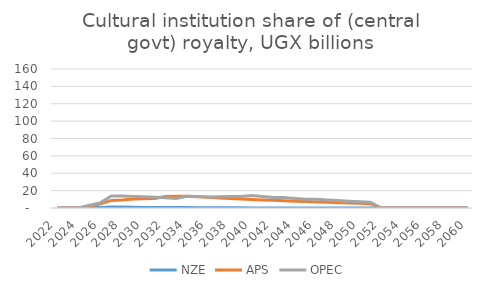
| Category | NZE | APS | OPEC |
|---|---|---|---|
| 2022.0 | 0 | 0 | 0 |
| 2023.0 | 0 | 0 | 0 |
| 2024.0 | 0 | 0 | 0 |
| 2025.0 | 0.379 | 2.177 | 3.181 |
| 2026.0 | 0.703 | 4.771 | 6.225 |
| 2027.0 | 1.242 | 8.715 | 13.737 |
| 2028.0 | 1.242 | 9.274 | 13.867 |
| 2029.0 | 0.879 | 10.394 | 13.381 |
| 2030.0 | 0.515 | 10.576 | 12.908 |
| 2031.0 | 0.514 | 11.024 | 12.446 |
| 2032.0 | 0.513 | 13.312 | 11.933 |
| 2033.0 | 0.493 | 13.628 | 11.042 |
| 2034.0 | 0.462 | 13.565 | 13.565 |
| 2035.0 | 0.426 | 12.925 | 13.138 |
| 2036.0 | 0.393 | 12.274 | 12.657 |
| 2037.0 | 0.362 | 11.621 | 13.001 |
| 2038.0 | 0.334 | 10.975 | 13.146 |
| 2039.0 | 0.307 | 10.34 | 13.13 |
| 2040.0 | 0.084 | 9.847 | 14.238 |
| 2041.0 | 0 | 9.349 | 13.173 |
| 2042.0 | 0 | 8.851 | 12.15 |
| 2043.0 | 0 | 8.36 | 11.976 |
| 2044.0 | 0 | 7.878 | 11.051 |
| 2045.0 | 0 | 7.41 | 10.2 |
| 2046.0 | 0 | 6.958 | 10.02 |
| 2047.0 | 0 | 6.524 | 9.253 |
| 2048.0 | 0 | 6.108 | 8.548 |
| 2049.0 | 0 | 5.711 | 7.899 |
| 2050.0 | 0 | 5.335 | 7.302 |
| 2051.0 | 0 | 4.933 | 6.753 |
| 2052.0 | 0 | 0 | 0 |
| 2053.0 | 0 | 0 | 0 |
| 2054.0 | 0 | 0 | 0 |
| 2055.0 | 0 | 0 | 0 |
| 2056.0 | 0 | 0 | 0 |
| 2057.0 | 0 | 0 | 0 |
| 2058.0 | 0 | 0 | 0 |
| 2059.0 | 0 | 0 | 0 |
| 2060.0 | 0 | 0 | 0 |